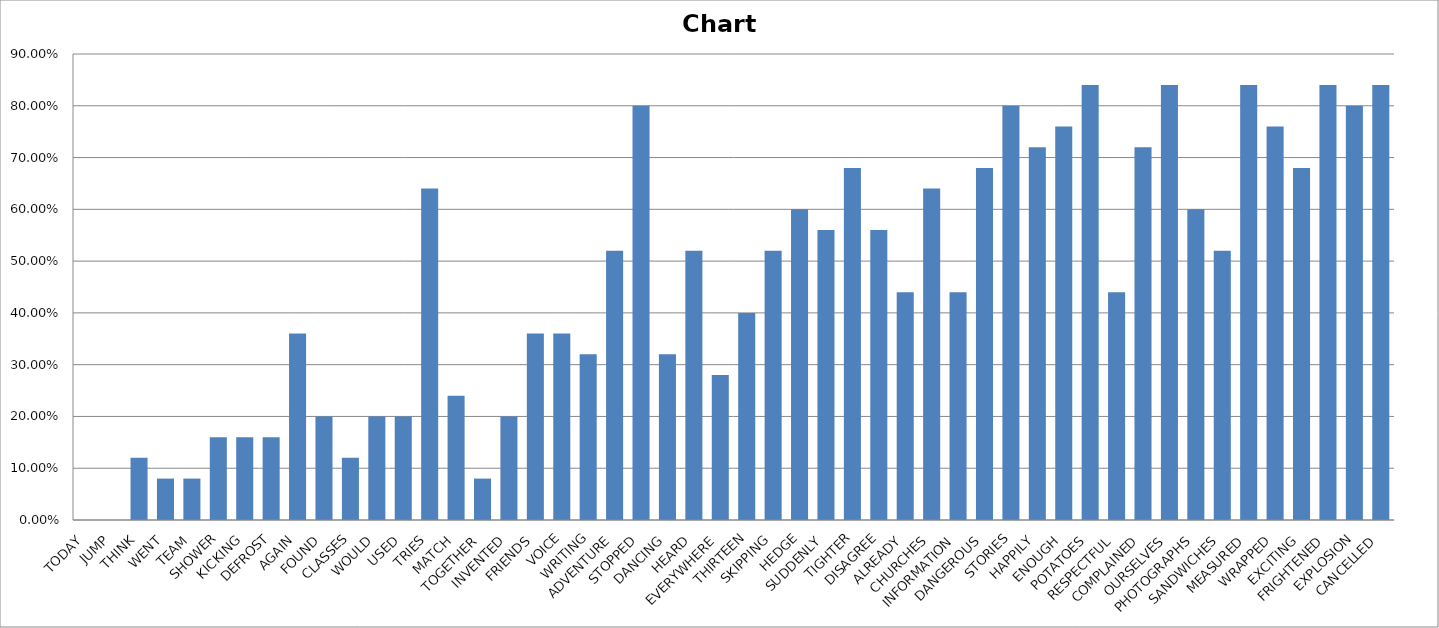
| Category | Series 0 |
|---|---|
| TODAY | 0 |
| JUMP | 0 |
| THINK | 0.12 |
| WENT | 0.08 |
| TEAM | 0.08 |
| SHOWER | 0.16 |
| KICKING | 0.16 |
| DEFROST | 0.16 |
| AGAIN | 0.36 |
| FOUND | 0.2 |
| CLASSES | 0.12 |
| WOULD | 0.2 |
| USED | 0.2 |
| TRIES | 0.64 |
| MATCH | 0.24 |
| TOGETHER | 0.08 |
| INVENTED | 0.2 |
| FRIENDS | 0.36 |
| VOICE | 0.36 |
| WRITING | 0.32 |
| ADVENTURE | 0.52 |
| STOPPED | 0.8 |
| DANCING | 0.32 |
| HEARD | 0.52 |
| EVERYWHERE | 0.28 |
| THIRTEEN | 0.4 |
| SKIPPING | 0.52 |
| HEDGE | 0.6 |
| SUDDENLY | 0.56 |
| TIGHTER | 0.68 |
| DISAGREE | 0.56 |
| ALREADY | 0.44 |
| CHURCHES | 0.64 |
| INFORMATION | 0.44 |
| DANGEROUS | 0.68 |
| STORIES | 0.8 |
| HAPPILY | 0.72 |
| ENOUGH | 0.76 |
| POTATOES | 0.84 |
| RESPECTFUL | 0.44 |
| COMPLAINED | 0.72 |
| OURSELVES | 0.84 |
| PHOTOGRAPHS | 0.6 |
| SANDWICHES | 0.52 |
| MEASURED | 0.84 |
| WRAPPED | 0.76 |
| EXCITING | 0.68 |
| FRIGHTENED | 0.84 |
| EXPLOSION | 0.8 |
| CANCELLED | 0.84 |